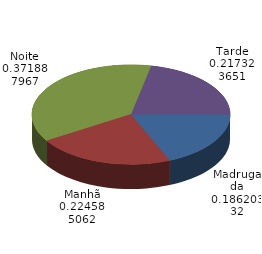
| Category | Qtde Acidentes |
|---|---|
| Madrugada | 359 |
| Manhã | 433 |
| Noite | 717 |
| Tarde | 419 |